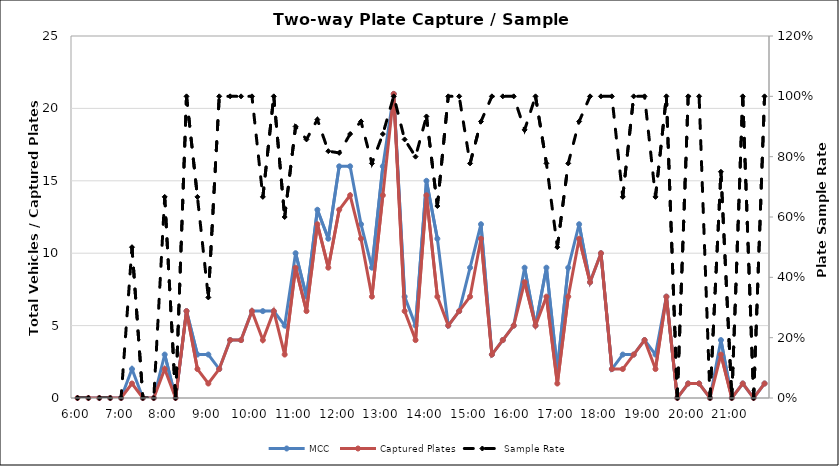
| Category | MCC | Captured Plates |
|---|---|---|
| 0.25 | 0 | 0 |
| 0.260416666666667 | 0 | 0 |
| 0.270833333333333 | 0 | 0 |
| 0.28125 | 0 | 0 |
| 0.291666666666667 | 0 | 0 |
| 0.302083333333333 | 2 | 1 |
| 0.3125 | 0 | 0 |
| 0.322916666666667 | 0 | 0 |
| 0.333333333333333 | 3 | 2 |
| 0.34375 | 0 | 0 |
| 0.354166666666667 | 6 | 6 |
| 0.364583333333333 | 3 | 2 |
| 0.375 | 3 | 1 |
| 0.385416666666667 | 2 | 2 |
| 0.395833333333333 | 4 | 4 |
| 0.40625 | 4 | 4 |
| 0.416666666666667 | 6 | 6 |
| 0.427083333333333 | 6 | 4 |
| 0.4375 | 6 | 6 |
| 0.447916666666667 | 5 | 3 |
| 0.458333333333333 | 10 | 9 |
| 0.46875 | 7 | 6 |
| 0.479166666666667 | 13 | 12 |
| 0.489583333333333 | 11 | 9 |
| 0.5 | 16 | 13 |
| 0.510416666666667 | 16 | 14 |
| 0.520833333333333 | 12 | 11 |
| 0.53125 | 9 | 7 |
| 0.541666666666667 | 16 | 14 |
| 0.552083333333333 | 21 | 21 |
| 0.5625 | 7 | 6 |
| 0.572916666666667 | 5 | 4 |
| 0.583333333333333 | 15 | 14 |
| 0.59375 | 11 | 7 |
| 0.604166666666667 | 5 | 5 |
| 0.614583333333333 | 6 | 6 |
| 0.625 | 9 | 7 |
| 0.635416666666667 | 12 | 11 |
| 0.645833333333333 | 3 | 3 |
| 0.65625 | 4 | 4 |
| 0.666666666666667 | 5 | 5 |
| 0.677083333333333 | 9 | 8 |
| 0.6875 | 5 | 5 |
| 0.697916666666667 | 9 | 7 |
| 0.708333333333333 | 2 | 1 |
| 0.71875 | 9 | 7 |
| 0.729166666666667 | 12 | 11 |
| 0.739583333333333 | 8 | 8 |
| 0.75 | 10 | 10 |
| 0.760416666666667 | 2 | 2 |
| 0.770833333333333 | 3 | 2 |
| 0.78125 | 3 | 3 |
| 0.791666666666667 | 4 | 4 |
| 0.802083333333333 | 3 | 2 |
| 0.8125 | 7 | 7 |
| 0.822916666666667 | 0 | 0 |
| 0.833333333333333 | 1 | 1 |
| 0.84375 | 1 | 1 |
| 0.854166666666667 | 0 | 0 |
| 0.864583333333333 | 4 | 3 |
| 0.875 | 0 | 0 |
| 0.885416666666667 | 1 | 1 |
| 0.895833333333333 | 0 | 0 |
| 0.90625 | 1 | 1 |